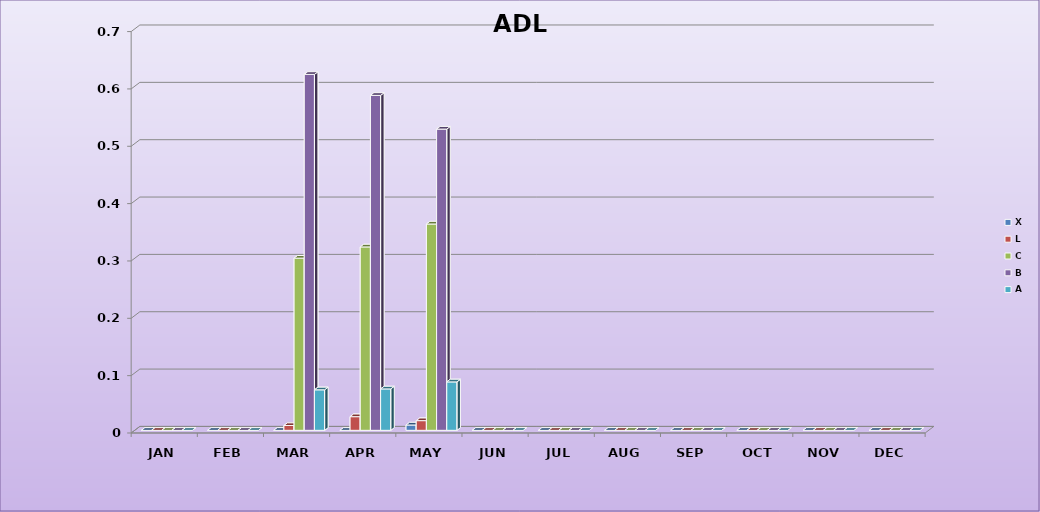
| Category | X | L | C | B | A |
|---|---|---|---|---|---|
| 0 | 0 | 0 | 0 | 0 | 0 |
| 1 | 0 | 0 | 0 | 0 | 0 |
| 2 | 0 | 0.008 | 0.3 | 0.621 | 0.071 |
| 3 | 0 | 0.024 | 0.32 | 0.584 | 0.072 |
| 4 | 0.009 | 0.017 | 0.36 | 0.525 | 0.084 |
| 5 | 0 | 0 | 0 | 0 | 0 |
| 6 | 0 | 0 | 0 | 0 | 0 |
| 7 | 0 | 0 | 0 | 0 | 0 |
| 8 | 0 | 0 | 0 | 0 | 0 |
| 9 | 0 | 0 | 0 | 0 | 0 |
| 10 | 0 | 0 | 0 | 0 | 0 |
| 11 | 0 | 0 | 0 | 0 | 0 |